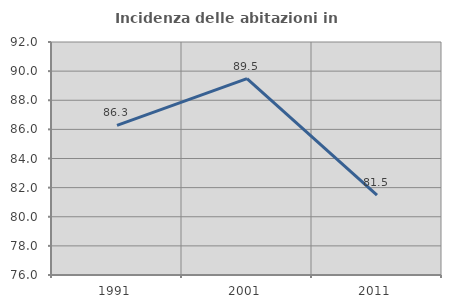
| Category | Incidenza delle abitazioni in proprietà  |
|---|---|
| 1991.0 | 86.269 |
| 2001.0 | 89.481 |
| 2011.0 | 81.488 |